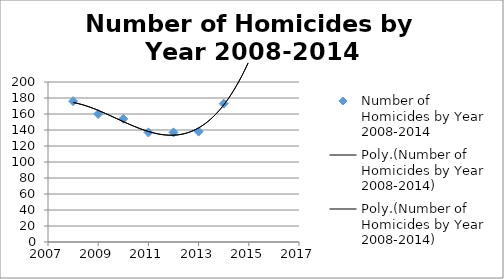
| Category | Number of Homicides by Year 2008-2014 |
|---|---|
| 2008.0 | 176 |
| 2009.0 | 160 |
| 2010.0 | 154 |
| 2011.0 | 137 |
| 2012.0 | 137 |
| 2013.0 | 138 |
| 2014.0 | 173 |